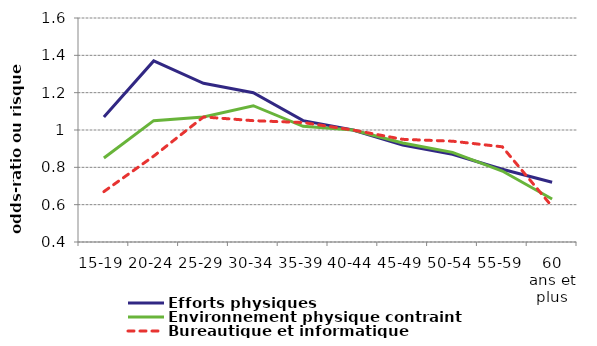
| Category | Efforts physiques | Environnement physique contraint | Bureautique et informatique |
|---|---|---|---|
| 15-19 | 1.07 | 0.85 | 0.67 |
| 20-24 | 1.37 | 1.05 | 0.86 |
| 25-29 | 1.25 | 1.07 | 1.07 |
| 30-34 | 1.2 | 1.13 | 1.05 |
| 35-39 | 1.05 | 1.02 | 1.04 |
| 40-44 | 1 | 1 | 1 |
| 45-49 | 0.92 | 0.93 | 0.95 |
| 50-54 | 0.87 | 0.88 | 0.94 |
| 55-59 | 0.79 | 0.78 | 0.91 |
| 60 ans et plus | 0.72 | 0.63 | 0.59 |